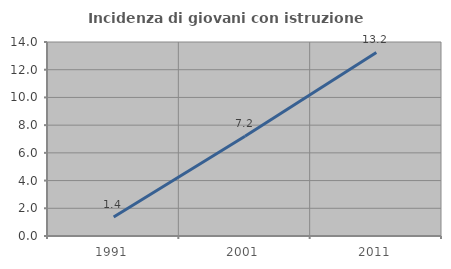
| Category | Incidenza di giovani con istruzione universitaria |
|---|---|
| 1991.0 | 1.365 |
| 2001.0 | 7.202 |
| 2011.0 | 13.245 |